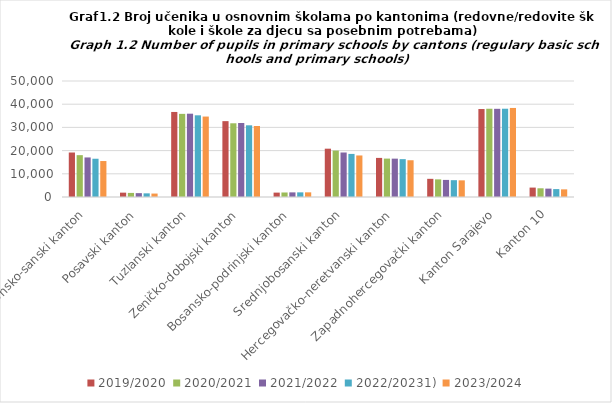
| Category | 2019/2020 | 2020/2021 | 2021/2022 | 2022/20231) | 2023/2024 |
|---|---|---|---|---|---|
| Unsko-sanski kanton | 19176 | 18034 | 17049 | 16491 | 15503 |
| Posavski kanton | 1877 | 1762 | 1662 | 1575 | 1483 |
| Tuzlanski kanton | 36655 | 35839 | 35907 | 35212 | 34675 |
| Zeničko-dobojski kanton | 32698 | 31774 | 31895 | 30901 | 30596 |
| Bosansko-podrinjski kanton | 1891 | 1947 | 1995 | 2006 | 2008 |
| Srednjobosanski kanton | 20826 | 20009 | 19185 | 18572 | 17903 |
| Hercegovačko-neretvanski kanton | 16852 | 16555 | 16531 | 16318 | 15841 |
| Zapadnohercegovački kanton | 7830 | 7598 | 7365 | 7252 | 7176 |
| Kanton Sarajevo | 37917 | 38043 | 38014 | 38048 | 38379 |
| Kanton 10 | 4059 | 3755 | 3610 | 3411 | 3295 |